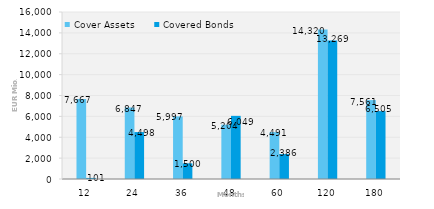
| Category | Cover Assets | Covered Bonds |
|---|---|---|
| 12.0 | 7666.922 | 101 |
| 24.0 | 6847.017 | 4497.622 |
| 36.0 | 5997.011 | 1500 |
| 48.0 | 5204.025 | 6049.4 |
| 60.0 | 4491.452 | 2386.375 |
| 120.0 | 14320.104 | 13268.84 |
| 180.0 | 7560.749 | 6505 |